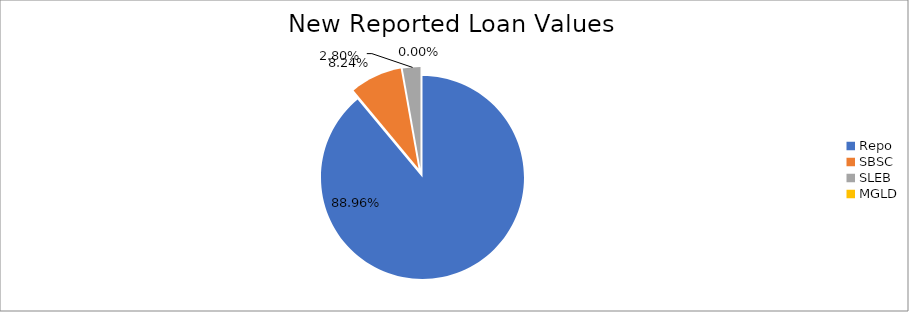
| Category | Series 0 |
|---|---|
| Repo | 9822047.973 |
| SBSC | 909427.886 |
| SLEB | 309434.782 |
| MGLD | 79.843 |